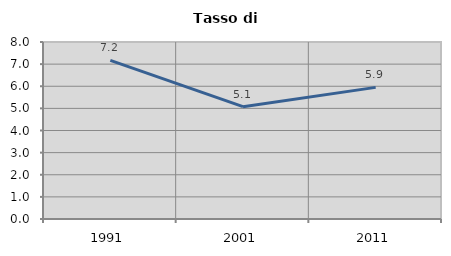
| Category | Tasso di disoccupazione   |
|---|---|
| 1991.0 | 7.17 |
| 2001.0 | 5.075 |
| 2011.0 | 5.949 |